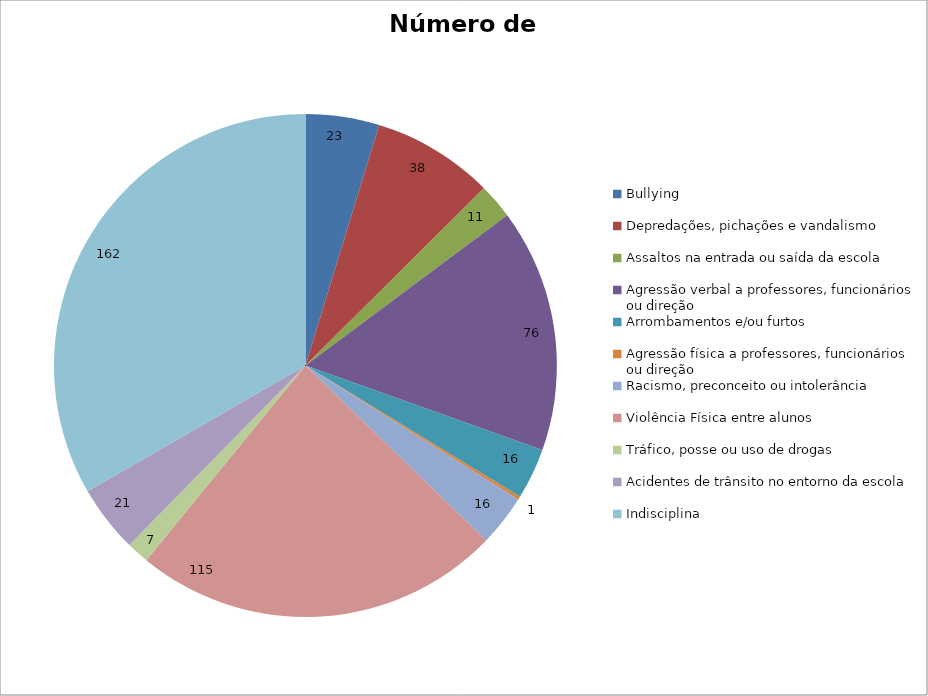
| Category | Número de Casos |
|---|---|
| Bullying | 23 |
| Depredações, pichações e vandalismo | 38 |
| Assaltos na entrada ou saída da escola | 11 |
| Agressão verbal a professores, funcionários ou direção | 76 |
| Arrombamentos e/ou furtos | 16 |
| Agressão física a professores, funcionários ou direção | 1 |
| Racismo, preconceito ou intolerância | 16 |
| Violência Física entre alunos | 115 |
| Tráfico, posse ou uso de drogas | 7 |
| Acidentes de trânsito no entorno da escola | 21 |
| Indisciplina | 162 |